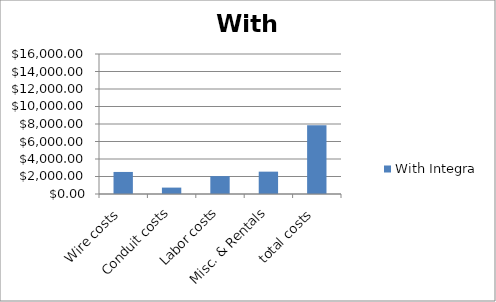
| Category | With Integra |
|---|---|
| Wire costs | 2520 |
| Conduit costs | 731 |
| Labor costs | 2045 |
| Misc. & Rentals | 2554 |
| total costs | 7850 |